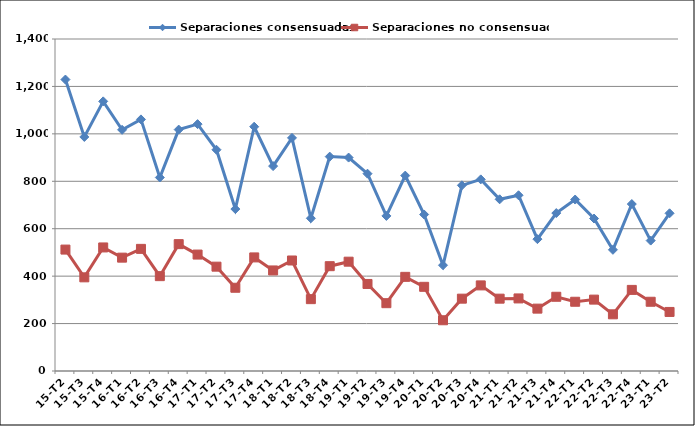
| Category | Separaciones consensuadas | Separaciones no consensuadas |
|---|---|---|
| 15-T2 | 1229 | 512 |
| 15-T3 | 987 | 395 |
| 15-T4 | 1137 | 521 |
| 16-T1 | 1017 | 478 |
| 16-T2 | 1061 | 515 |
| 16-T3 | 816 | 400 |
| 16-T4 | 1018 | 535 |
| 17-T1 | 1041 | 491 |
| 17-T2 | 933 | 440 |
| 17-T3 | 683 | 351 |
| 17-T4 | 1030 | 479 |
| 18-T1 | 864 | 424 |
| 18-T2 | 983 | 466 |
| 18-T3 | 644 | 303 |
| 18-T4 | 904 | 442 |
| 19-T1 | 900 | 461 |
| 19-T2 | 832 | 367 |
| 19-T3 | 654 | 286 |
| 19-T4 | 824 | 397 |
| 20-T1 | 660 | 355 |
| 20-T2 | 446 | 214 |
| 20-T3 | 783 | 305 |
| 20-T4 | 808 | 361 |
| 21-T1 | 724 | 305 |
| 21-T2 | 741 | 306 |
| 21-T3 | 556 | 263 |
| 21-T4 | 666 | 313 |
| 22-T1 | 723 | 292 |
| 22-T2 | 643 | 301 |
| 22-T3 | 511 | 239 |
| 22-T4 | 704 | 342 |
| 23-T1 | 550 | 292 |
| 23-T2 | 665 | 249 |